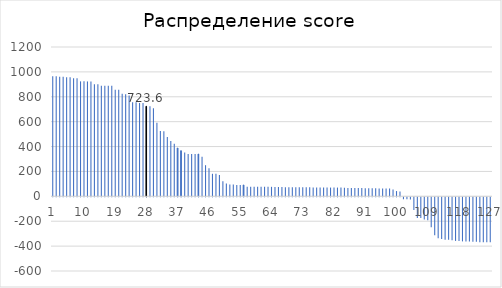
| Category | Series 0 |
|---|---|
| 0 | 965.5 |
| 1 | 965.5 |
| 2 | 961.2 |
| 3 | 961.2 |
| 4 | 956.8 |
| 5 | 956.8 |
| 6 | 949.7 |
| 7 | 949.7 |
| 8 | 923.8 |
| 9 | 923.8 |
| 10 | 923.2 |
| 11 | 923.2 |
| 12 | 899.8 |
| 13 | 899.8 |
| 14 | 889.2 |
| 15 | 889.2 |
| 16 | 889.2 |
| 17 | 889.2 |
| 18 | 857 |
| 19 | 857 |
| 20 | 823.9 |
| 21 | 821.3 |
| 22 | 809.6 |
| 23 | 755.6 |
| 24 | 755.6 |
| 25 | 750.9 |
| 26 | 750.9 |
| 27 | 723.6 |
| 28 | 723.6 |
| 29 | 708.3 |
| 30 | 591.8 |
| 31 | 526 |
| 32 | 522.6 |
| 33 | 476.3 |
| 34 | 444.6 |
| 35 | 422 |
| 36 | 388.3 |
| 37 | 366.9 |
| 38 | 352.7 |
| 39 | 340.1 |
| 40 | 340.1 |
| 41 | 340 |
| 42 | 340 |
| 43 | 317.4 |
| 44 | 250.2 |
| 45 | 225.9 |
| 46 | 181.2 |
| 47 | 181.2 |
| 48 | 172 |
| 49 | 121.7 |
| 50 | 102.9 |
| 51 | 95.9 |
| 52 | 95 |
| 53 | 91.8 |
| 54 | 91.8 |
| 55 | 91.4 |
| 56 | 76.9 |
| 57 | 76.9 |
| 58 | 76.9 |
| 59 | 76.9 |
| 60 | 76.9 |
| 61 | 76.4 |
| 62 | 76.4 |
| 63 | 76.4 |
| 64 | 75.7 |
| 65 | 75.7 |
| 66 | 74 |
| 67 | 73.1 |
| 68 | 73.1 |
| 69 | 73.1 |
| 70 | 73.1 |
| 71 | 72.5 |
| 72 | 72.5 |
| 73 | 72.5 |
| 74 | 72.5 |
| 75 | 71.3 |
| 76 | 70.4 |
| 77 | 70.4 |
| 78 | 70.4 |
| 79 | 70.4 |
| 80 | 70.4 |
| 81 | 70.4 |
| 82 | 70.4 |
| 83 | 70.4 |
| 84 | 69.9 |
| 85 | 66.8 |
| 86 | 66.8 |
| 87 | 66.8 |
| 88 | 66.8 |
| 89 | 66.1 |
| 90 | 64.1 |
| 91 | 64.1 |
| 92 | 64.1 |
| 93 | 64.1 |
| 94 | 63.5 |
| 95 | 63.5 |
| 96 | 63.5 |
| 97 | 63.5 |
| 98 | 55.4 |
| 99 | 42.4 |
| 100 | 38.3 |
| 101 | -14.5 |
| 102 | -14.8 |
| 103 | -18.1 |
| 104 | -102.2 |
| 105 | -165.4 |
| 106 | -167 |
| 107 | -179.1 |
| 108 | -185 |
| 109 | -241.1 |
| 110 | -304.3 |
| 111 | -327.9 |
| 112 | -335.1 |
| 113 | -340.9 |
| 114 | -340.9 |
| 115 | -344.3 |
| 116 | -350.1 |
| 117 | -350.8 |
| 118 | -354.1 |
| 119 | -355.2 |
| 120 | -355.4 |
| 121 | -356.5 |
| 122 | -356.9 |
| 123 | -360.1 |
| 124 | -360.2 |
| 125 | -360.6 |
| 126 | -361 |